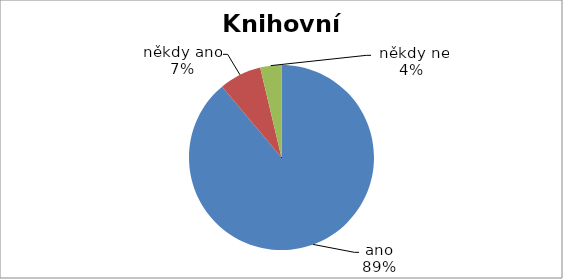
| Category | Celkem |
|---|---|
| ano | 24 |
| někdy ano, někdy ne | 2 |
| nevím, nemohu odpovědět | 1 |